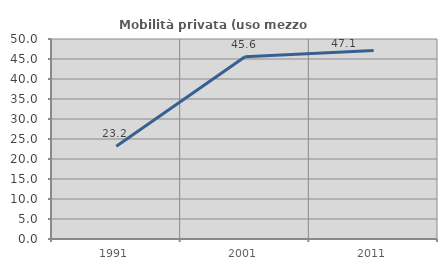
| Category | Mobilità privata (uso mezzo privato) |
|---|---|
| 1991.0 | 23.179 |
| 2001.0 | 45.578 |
| 2011.0 | 47.134 |